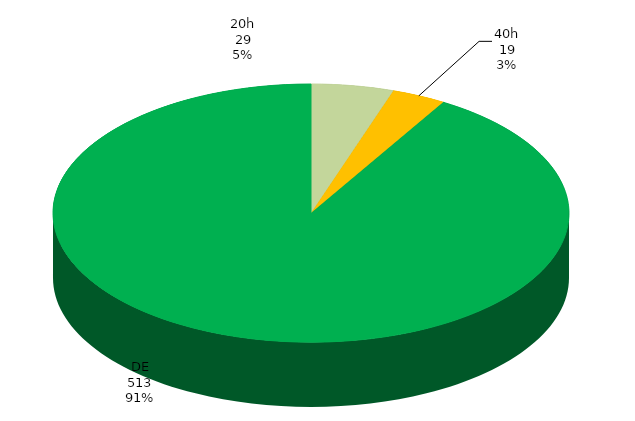
| Category | Total Geral |
|---|---|
| 20h | 29 |
| 40h | 19 |
| DE | 513 |